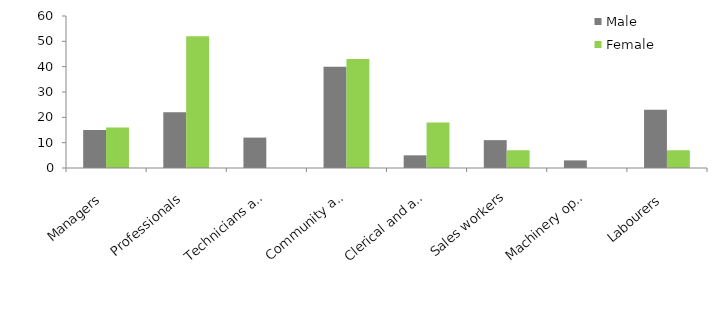
| Category | Male | Female |
|---|---|---|
| Managers | 15 | 16 |
| Professionals | 22 | 52 |
| Technicians and trades workers | 12 | 0 |
| Community and personal service workers | 40 | 43 |
| Clerical and administrative workers | 5 | 18 |
| Sales workers | 11 | 7 |
| Machinery operators and drivers | 3 | 0 |
| Labourers | 23 | 7 |